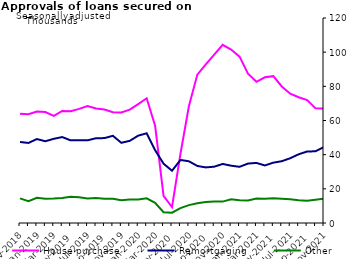
| Category | House purchase | Remortgaging | Other |
|---|---|---|---|
| Nov-2018 | 63945 | 47422 | 14391 |
| Dec-2018 | 63628 | 46858 | 12724 |
| Jan-2019 | 65223 | 49143 | 14742 |
| Feb-2019 | 64925 | 47865 | 14264 |
| Mar-2019 | 62752 | 49281 | 14299 |
| Apr-2019 | 65574 | 50309 | 14694 |
| May-2019 | 65367 | 48371 | 15317 |
| Jun-2019 | 66792 | 48426 | 15070 |
| Jul-2019 | 68489 | 48409 | 14315 |
| Aug-2019 | 67030 | 49620 | 14612 |
| Sep-2019 | 66399 | 49699 | 14254 |
| Oct-2019 | 64886 | 51041 | 14147 |
| Nov-2019 | 64728 | 46942 | 13388 |
| Dec-2019 | 66376 | 48103 | 13742 |
| Jan-2020 | 69635 | 51135 | 13700 |
| Feb-2020 | 73014 | 52514 | 14488 |
| Mar-2020 | 56957 | 42637 | 11821 |
| Apr-2020 | 15825 | 34718 | 6316 |
| May-2020 | 9302 | 30594 | 6044 |
| Jun-2020 | 40477 | 36892 | 8711 |
| Jul-2020 | 68312 | 36142 | 10480 |
| Aug-2020 | 86865 | 33393 | 11567 |
| Sep-2020 | 92796 | 32541 | 12319 |
| Oct-2020 | 98533 | 32965 | 12615 |
| Nov-2020 | 104306 | 34569 | 12517 |
| Dec-2020 | 101508 | 33545 | 13880 |
| Jan-2021 | 97396 | 32893 | 13291 |
| Feb-2021 | 87410 | 34789 | 13193 |
| Mar-2021 | 82639 | 35167 | 14300 |
| Apr-2021 | 85286 | 33686 | 14191 |
| May-2021 | 85960 | 35321 | 14483 |
| Jun-2021 | 79927 | 36172 | 14157 |
| Jul-2021 | 75673 | 37914 | 13842 |
| Aug-2021 | 73613 | 40228 | 13315 |
| Sep-2021 | 71954 | 41845 | 12973 |
| Oct-2021 | 67103 | 41978 | 13622 |
| Nov-2021 | 66964 | 44529 | 14267 |